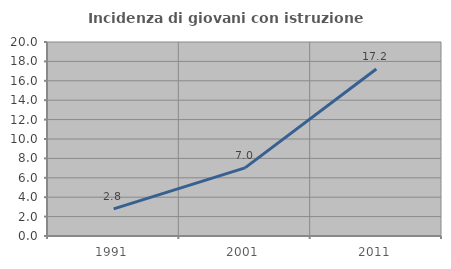
| Category | Incidenza di giovani con istruzione universitaria |
|---|---|
| 1991.0 | 2.797 |
| 2001.0 | 7.019 |
| 2011.0 | 17.21 |